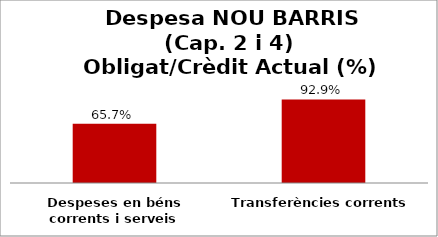
| Category | Series 0 |
|---|---|
| Despeses en béns corrents i serveis | 0.657 |
| Transferències corrents | 0.929 |